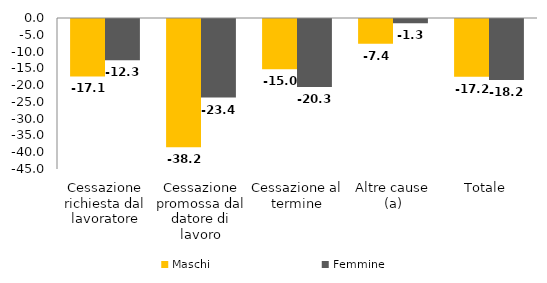
| Category | Maschi | Femmine |
|---|---|---|
| Cessazione richiesta dal lavoratore | -17.1 | -12.3 |
| Cessazione promossa dal datore di lavoro | -38.2 | -23.4 |
| Cessazione al termine | -15 | -20.3 |
| Altre cause (a) | -7.4 | -1.3 |
| Totale  | -17.2 | -18.2 |